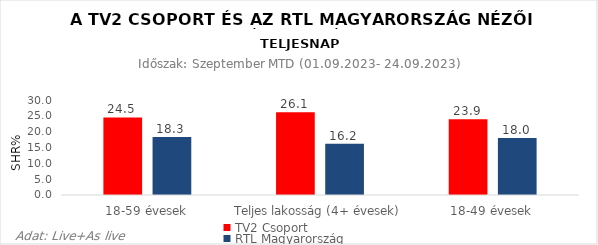
| Category | TV2 Csoport | RTL Magyarország |
|---|---|---|
| 18-59 évesek | 24.5 | 18.3 |
| Teljes lakosság (4+ évesek) | 26.1 | 16.2 |
| 18-49 évesek | 23.9 | 18 |